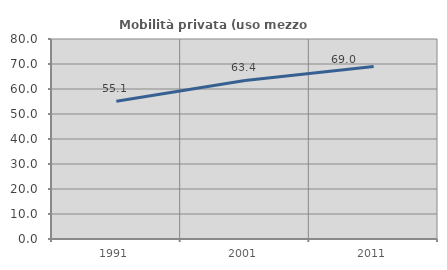
| Category | Mobilità privata (uso mezzo privato) |
|---|---|
| 1991.0 | 55.109 |
| 2001.0 | 63.433 |
| 2011.0 | 69.014 |